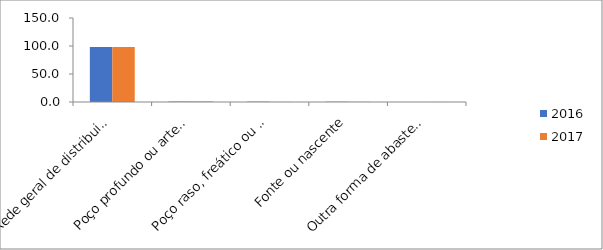
| Category | 2016 | 2017 |
|---|---|---|
| Rede geral de distribuição | 98.2 | 98.4 |
| Poço profundo ou artesiano | 0.8 | 1 |
| Poço raso, freático ou cacimba | 0.6 | 0.2 |
| Fonte ou nascente | 0.5 | 0.3 |
| Outra forma de abastecimento | 0 | 0.1 |